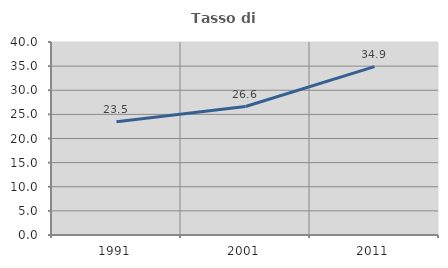
| Category | Tasso di occupazione   |
|---|---|
| 1991.0 | 23.495 |
| 2001.0 | 26.621 |
| 2011.0 | 34.91 |